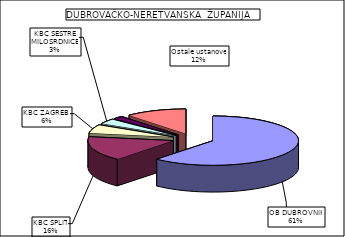
| Category | Series 0 |
|---|---|
| OB DUBROVNIK | 61.445 |
| KBC SPLIT | 16.088 |
| KBC ZAGREB  | 5.678 |
| KBC SESTRE MILOSRDNICE | 3.404 |
| SPECIJALNA BOLNICA ZA MEDICINSKU REHABILITACIJU  "KALOS" | 1.819 |
| Ostale ustanove | 11.565 |